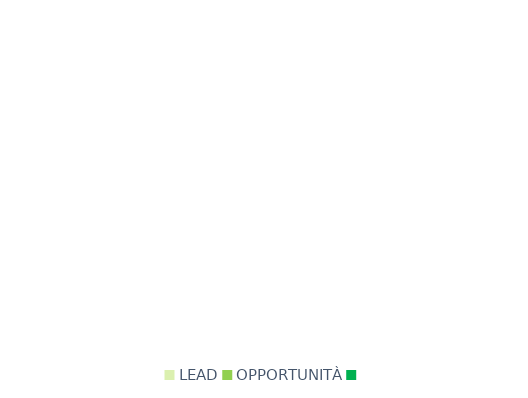
| Category | Series 0 |
|---|---|
| LEAD | 0 |
| OPPORTUNITÀ | 0 |